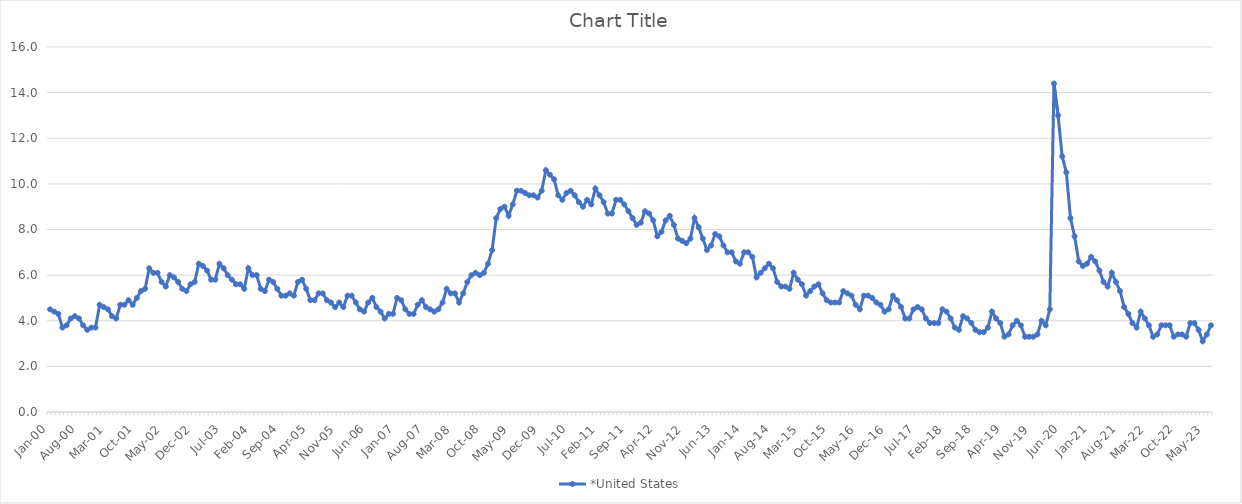
| Category | *United States | Alaska | Alabama | Arkansas | Arizona | California | Colorado | Connecticut | Delaware | Florida | Georgia | Hawaii | Iowa | Idaho | Illinois | Indiana | Kansas | Kentucky | Louisiana | Massachusetts | Maryland | Maine | Michigan | Minnesota | Missouri | Mississippi | Montana | North Carolina | North Dakota | Nebraska | New Hampshire | New Jersey | New Mexico | Nevada | New York | Ohio | Oklahoma | Oregon | Pennsylvania | Rhode Island | South Carolina | South Dakota | Tennessee | Texas | Utah | Virginia | Vermont | Washington | Wisconsin | West Virginia | Wyoming | Series 51 |
|---|---|---|---|---|---|---|---|---|---|---|---|---|---|---|---|---|---|---|---|---|---|---|---|---|---|---|---|---|---|---|---|---|---|---|---|---|---|---|---|---|---|---|---|---|---|---|---|---|---|---|---|---|
| Jan-00 | 4.5 |  |  |  |  |  |  |  |  |  |  |  |  |  |  |  |  |  |  |  |  |  |  |  |  |  |  |  |  |  |  |  |  |  |  |  |  |  |  |  |  |  |  |  |  |  |  |  |  |  |  |  |
| Feb-00 | 4.4 |  |  |  |  |  |  |  |  |  |  |  |  |  |  |  |  |  |  |  |  |  |  |  |  |  |  |  |  |  |  |  |  |  |  |  |  |  |  |  |  |  |  |  |  |  |  |  |  |  |  |  |
| Mar-00 | 4.3 |  |  |  |  |  |  |  |  |  |  |  |  |  |  |  |  |  |  |  |  |  |  |  |  |  |  |  |  |  |  |  |  |  |  |  |  |  |  |  |  |  |  |  |  |  |  |  |  |  |  |  |
| Apr-00 | 3.7 |  |  |  |  |  |  |  |  |  |  |  |  |  |  |  |  |  |  |  |  |  |  |  |  |  |  |  |  |  |  |  |  |  |  |  |  |  |  |  |  |  |  |  |  |  |  |  |  |  |  |  |
| May-00 | 3.8 |  |  |  |  |  |  |  |  |  |  |  |  |  |  |  |  |  |  |  |  |  |  |  |  |  |  |  |  |  |  |  |  |  |  |  |  |  |  |  |  |  |  |  |  |  |  |  |  |  |  |  |
| Jun-00 | 4.1 |  |  |  |  |  |  |  |  |  |  |  |  |  |  |  |  |  |  |  |  |  |  |  |  |  |  |  |  |  |  |  |  |  |  |  |  |  |  |  |  |  |  |  |  |  |  |  |  |  |  |  |
| Jul-00 | 4.2 |  |  |  |  |  |  |  |  |  |  |  |  |  |  |  |  |  |  |  |  |  |  |  |  |  |  |  |  |  |  |  |  |  |  |  |  |  |  |  |  |  |  |  |  |  |  |  |  |  |  |  |
| Aug-00 | 4.1 |  |  |  |  |  |  |  |  |  |  |  |  |  |  |  |  |  |  |  |  |  |  |  |  |  |  |  |  |  |  |  |  |  |  |  |  |  |  |  |  |  |  |  |  |  |  |  |  |  |  |  |
| Sep-00 | 3.8 |  |  |  |  |  |  |  |  |  |  |  |  |  |  |  |  |  |  |  |  |  |  |  |  |  |  |  |  |  |  |  |  |  |  |  |  |  |  |  |  |  |  |  |  |  |  |  |  |  |  |  |
| Oct-00 | 3.6 |  |  |  |  |  |  |  |  |  |  |  |  |  |  |  |  |  |  |  |  |  |  |  |  |  |  |  |  |  |  |  |  |  |  |  |  |  |  |  |  |  |  |  |  |  |  |  |  |  |  |  |
| Nov-00 | 3.7 |  |  |  |  |  |  |  |  |  |  |  |  |  |  |  |  |  |  |  |  |  |  |  |  |  |  |  |  |  |  |  |  |  |  |  |  |  |  |  |  |  |  |  |  |  |  |  |  |  |  |  |
| Dec-00 | 3.7 |  |  |  |  |  |  |  |  |  |  |  |  |  |  |  |  |  |  |  |  |  |  |  |  |  |  |  |  |  |  |  |  |  |  |  |  |  |  |  |  |  |  |  |  |  |  |  |  |  |  |  |
| Jan-01 | 4.7 |  |  |  |  |  |  |  |  |  |  |  |  |  |  |  |  |  |  |  |  |  |  |  |  |  |  |  |  |  |  |  |  |  |  |  |  |  |  |  |  |  |  |  |  |  |  |  |  |  |  |  |
| Feb-01 | 4.6 |  |  |  |  |  |  |  |  |  |  |  |  |  |  |  |  |  |  |  |  |  |  |  |  |  |  |  |  |  |  |  |  |  |  |  |  |  |  |  |  |  |  |  |  |  |  |  |  |  |  |  |
| Mar-01 | 4.5 |  |  |  |  |  |  |  |  |  |  |  |  |  |  |  |  |  |  |  |  |  |  |  |  |  |  |  |  |  |  |  |  |  |  |  |  |  |  |  |  |  |  |  |  |  |  |  |  |  |  |  |
| Apr-01 | 4.2 |  |  |  |  |  |  |  |  |  |  |  |  |  |  |  |  |  |  |  |  |  |  |  |  |  |  |  |  |  |  |  |  |  |  |  |  |  |  |  |  |  |  |  |  |  |  |  |  |  |  |  |
| May-01 | 4.1 |  |  |  |  |  |  |  |  |  |  |  |  |  |  |  |  |  |  |  |  |  |  |  |  |  |  |  |  |  |  |  |  |  |  |  |  |  |  |  |  |  |  |  |  |  |  |  |  |  |  |  |
| Jun-01 | 4.7 |  |  |  |  |  |  |  |  |  |  |  |  |  |  |  |  |  |  |  |  |  |  |  |  |  |  |  |  |  |  |  |  |  |  |  |  |  |  |  |  |  |  |  |  |  |  |  |  |  |  |  |
| Jul-01 | 4.7 |  |  |  |  |  |  |  |  |  |  |  |  |  |  |  |  |  |  |  |  |  |  |  |  |  |  |  |  |  |  |  |  |  |  |  |  |  |  |  |  |  |  |  |  |  |  |  |  |  |  |  |
| Aug-01 | 4.9 |  |  |  |  |  |  |  |  |  |  |  |  |  |  |  |  |  |  |  |  |  |  |  |  |  |  |  |  |  |  |  |  |  |  |  |  |  |  |  |  |  |  |  |  |  |  |  |  |  |  |  |
| Sep-01 | 4.7 |  |  |  |  |  |  |  |  |  |  |  |  |  |  |  |  |  |  |  |  |  |  |  |  |  |  |  |  |  |  |  |  |  |  |  |  |  |  |  |  |  |  |  |  |  |  |  |  |  |  |  |
| Oct-01 | 5 |  |  |  |  |  |  |  |  |  |  |  |  |  |  |  |  |  |  |  |  |  |  |  |  |  |  |  |  |  |  |  |  |  |  |  |  |  |  |  |  |  |  |  |  |  |  |  |  |  |  |  |
| Nov-01 | 5.3 |  |  |  |  |  |  |  |  |  |  |  |  |  |  |  |  |  |  |  |  |  |  |  |  |  |  |  |  |  |  |  |  |  |  |  |  |  |  |  |  |  |  |  |  |  |  |  |  |  |  |  |
| Dec-01 | 5.4 |  |  |  |  |  |  |  |  |  |  |  |  |  |  |  |  |  |  |  |  |  |  |  |  |  |  |  |  |  |  |  |  |  |  |  |  |  |  |  |  |  |  |  |  |  |  |  |  |  |  |  |
| Jan-02 | 6.3 |  |  |  |  |  |  |  |  |  |  |  |  |  |  |  |  |  |  |  |  |  |  |  |  |  |  |  |  |  |  |  |  |  |  |  |  |  |  |  |  |  |  |  |  |  |  |  |  |  |  |  |
| Feb-02 | 6.1 |  |  |  |  |  |  |  |  |  |  |  |  |  |  |  |  |  |  |  |  |  |  |  |  |  |  |  |  |  |  |  |  |  |  |  |  |  |  |  |  |  |  |  |  |  |  |  |  |  |  |  |
| Mar-02 | 6.1 |  |  |  |  |  |  |  |  |  |  |  |  |  |  |  |  |  |  |  |  |  |  |  |  |  |  |  |  |  |  |  |  |  |  |  |  |  |  |  |  |  |  |  |  |  |  |  |  |  |  |  |
| Apr-02 | 5.7 |  |  |  |  |  |  |  |  |  |  |  |  |  |  |  |  |  |  |  |  |  |  |  |  |  |  |  |  |  |  |  |  |  |  |  |  |  |  |  |  |  |  |  |  |  |  |  |  |  |  |  |
| May-02 | 5.5 |  |  |  |  |  |  |  |  |  |  |  |  |  |  |  |  |  |  |  |  |  |  |  |  |  |  |  |  |  |  |  |  |  |  |  |  |  |  |  |  |  |  |  |  |  |  |  |  |  |  |  |
| Jun-02 | 6 |  |  |  |  |  |  |  |  |  |  |  |  |  |  |  |  |  |  |  |  |  |  |  |  |  |  |  |  |  |  |  |  |  |  |  |  |  |  |  |  |  |  |  |  |  |  |  |  |  |  |  |
| Jul-02 | 5.9 |  |  |  |  |  |  |  |  |  |  |  |  |  |  |  |  |  |  |  |  |  |  |  |  |  |  |  |  |  |  |  |  |  |  |  |  |  |  |  |  |  |  |  |  |  |  |  |  |  |  |  |
| Aug-02 | 5.7 |  |  |  |  |  |  |  |  |  |  |  |  |  |  |  |  |  |  |  |  |  |  |  |  |  |  |  |  |  |  |  |  |  |  |  |  |  |  |  |  |  |  |  |  |  |  |  |  |  |  |  |
| Sep-02 | 5.4 |  |  |  |  |  |  |  |  |  |  |  |  |  |  |  |  |  |  |  |  |  |  |  |  |  |  |  |  |  |  |  |  |  |  |  |  |  |  |  |  |  |  |  |  |  |  |  |  |  |  |  |
| Oct-02 | 5.3 |  |  |  |  |  |  |  |  |  |  |  |  |  |  |  |  |  |  |  |  |  |  |  |  |  |  |  |  |  |  |  |  |  |  |  |  |  |  |  |  |  |  |  |  |  |  |  |  |  |  |  |
| Nov-02 | 5.6 |  |  |  |  |  |  |  |  |  |  |  |  |  |  |  |  |  |  |  |  |  |  |  |  |  |  |  |  |  |  |  |  |  |  |  |  |  |  |  |  |  |  |  |  |  |  |  |  |  |  |  |
| Dec-02 | 5.7 |  |  |  |  |  |  |  |  |  |  |  |  |  |  |  |  |  |  |  |  |  |  |  |  |  |  |  |  |  |  |  |  |  |  |  |  |  |  |  |  |  |  |  |  |  |  |  |  |  |  |  |
| Jan-03 | 6.5 |  |  |  |  |  |  |  |  |  |  |  |  |  |  |  |  |  |  |  |  |  |  |  |  |  |  |  |  |  |  |  |  |  |  |  |  |  |  |  |  |  |  |  |  |  |  |  |  |  |  |  |
| Feb-03 | 6.4 |  |  |  |  |  |  |  |  |  |  |  |  |  |  |  |  |  |  |  |  |  |  |  |  |  |  |  |  |  |  |  |  |  |  |  |  |  |  |  |  |  |  |  |  |  |  |  |  |  |  |  |
| Mar-03 | 6.2 |  |  |  |  |  |  |  |  |  |  |  |  |  |  |  |  |  |  |  |  |  |  |  |  |  |  |  |  |  |  |  |  |  |  |  |  |  |  |  |  |  |  |  |  |  |  |  |  |  |  |  |
| Apr-03 | 5.8 |  |  |  |  |  |  |  |  |  |  |  |  |  |  |  |  |  |  |  |  |  |  |  |  |  |  |  |  |  |  |  |  |  |  |  |  |  |  |  |  |  |  |  |  |  |  |  |  |  |  |  |
| May-03 | 5.8 |  |  |  |  |  |  |  |  |  |  |  |  |  |  |  |  |  |  |  |  |  |  |  |  |  |  |  |  |  |  |  |  |  |  |  |  |  |  |  |  |  |  |  |  |  |  |  |  |  |  |  |
| Jun-03 | 6.5 |  |  |  |  |  |  |  |  |  |  |  |  |  |  |  |  |  |  |  |  |  |  |  |  |  |  |  |  |  |  |  |  |  |  |  |  |  |  |  |  |  |  |  |  |  |  |  |  |  |  |  |
| Jul-03 | 6.3 |  |  |  |  |  |  |  |  |  |  |  |  |  |  |  |  |  |  |  |  |  |  |  |  |  |  |  |  |  |  |  |  |  |  |  |  |  |  |  |  |  |  |  |  |  |  |  |  |  |  |  |
| Aug-03 | 6 |  |  |  |  |  |  |  |  |  |  |  |  |  |  |  |  |  |  |  |  |  |  |  |  |  |  |  |  |  |  |  |  |  |  |  |  |  |  |  |  |  |  |  |  |  |  |  |  |  |  |  |
| Sep-03 | 5.8 |  |  |  |  |  |  |  |  |  |  |  |  |  |  |  |  |  |  |  |  |  |  |  |  |  |  |  |  |  |  |  |  |  |  |  |  |  |  |  |  |  |  |  |  |  |  |  |  |  |  |  |
| Oct-03 | 5.6 |  |  |  |  |  |  |  |  |  |  |  |  |  |  |  |  |  |  |  |  |  |  |  |  |  |  |  |  |  |  |  |  |  |  |  |  |  |  |  |  |  |  |  |  |  |  |  |  |  |  |  |
| Nov-03 | 5.6 |  |  |  |  |  |  |  |  |  |  |  |  |  |  |  |  |  |  |  |  |  |  |  |  |  |  |  |  |  |  |  |  |  |  |  |  |  |  |  |  |  |  |  |  |  |  |  |  |  |  |  |
| Dec-03 | 5.4 |  |  |  |  |  |  |  |  |  |  |  |  |  |  |  |  |  |  |  |  |  |  |  |  |  |  |  |  |  |  |  |  |  |  |  |  |  |  |  |  |  |  |  |  |  |  |  |  |  |  |  |
| Jan-04 | 6.3 |  |  |  |  |  |  |  |  |  |  |  |  |  |  |  |  |  |  |  |  |  |  |  |  |  |  |  |  |  |  |  |  |  |  |  |  |  |  |  |  |  |  |  |  |  |  |  |  |  |  |  |
| Feb-04 | 6 |  |  |  |  |  |  |  |  |  |  |  |  |  |  |  |  |  |  |  |  |  |  |  |  |  |  |  |  |  |  |  |  |  |  |  |  |  |  |  |  |  |  |  |  |  |  |  |  |  |  |  |
| Mar-04 | 6 |  |  |  |  |  |  |  |  |  |  |  |  |  |  |  |  |  |  |  |  |  |  |  |  |  |  |  |  |  |  |  |  |  |  |  |  |  |  |  |  |  |  |  |  |  |  |  |  |  |  |  |
| Apr-04 | 5.4 |  |  |  |  |  |  |  |  |  |  |  |  |  |  |  |  |  |  |  |  |  |  |  |  |  |  |  |  |  |  |  |  |  |  |  |  |  |  |  |  |  |  |  |  |  |  |  |  |  |  |  |
| May-04 | 5.3 |  |  |  |  |  |  |  |  |  |  |  |  |  |  |  |  |  |  |  |  |  |  |  |  |  |  |  |  |  |  |  |  |  |  |  |  |  |  |  |  |  |  |  |  |  |  |  |  |  |  |  |
| Jun-04 | 5.8 |  |  |  |  |  |  |  |  |  |  |  |  |  |  |  |  |  |  |  |  |  |  |  |  |  |  |  |  |  |  |  |  |  |  |  |  |  |  |  |  |  |  |  |  |  |  |  |  |  |  |  |
| Jul-04 | 5.7 |  |  |  |  |  |  |  |  |  |  |  |  |  |  |  |  |  |  |  |  |  |  |  |  |  |  |  |  |  |  |  |  |  |  |  |  |  |  |  |  |  |  |  |  |  |  |  |  |  |  |  |
| Aug-04 | 5.4 |  |  |  |  |  |  |  |  |  |  |  |  |  |  |  |  |  |  |  |  |  |  |  |  |  |  |  |  |  |  |  |  |  |  |  |  |  |  |  |  |  |  |  |  |  |  |  |  |  |  |  |
| Sep-04 | 5.1 |  |  |  |  |  |  |  |  |  |  |  |  |  |  |  |  |  |  |  |  |  |  |  |  |  |  |  |  |  |  |  |  |  |  |  |  |  |  |  |  |  |  |  |  |  |  |  |  |  |  |  |
| Oct-04 | 5.1 |  |  |  |  |  |  |  |  |  |  |  |  |  |  |  |  |  |  |  |  |  |  |  |  |  |  |  |  |  |  |  |  |  |  |  |  |  |  |  |  |  |  |  |  |  |  |  |  |  |  |  |
| Nov-04 | 5.2 |  |  |  |  |  |  |  |  |  |  |  |  |  |  |  |  |  |  |  |  |  |  |  |  |  |  |  |  |  |  |  |  |  |  |  |  |  |  |  |  |  |  |  |  |  |  |  |  |  |  |  |
| Dec-04 | 5.1 |  |  |  |  |  |  |  |  |  |  |  |  |  |  |  |  |  |  |  |  |  |  |  |  |  |  |  |  |  |  |  |  |  |  |  |  |  |  |  |  |  |  |  |  |  |  |  |  |  |  |  |
| Jan-05 | 5.7 |  |  |  |  |  |  |  |  |  |  |  |  |  |  |  |  |  |  |  |  |  |  |  |  |  |  |  |  |  |  |  |  |  |  |  |  |  |  |  |  |  |  |  |  |  |  |  |  |  |  |  |
| Feb-05 | 5.8 |  |  |  |  |  |  |  |  |  |  |  |  |  |  |  |  |  |  |  |  |  |  |  |  |  |  |  |  |  |  |  |  |  |  |  |  |  |  |  |  |  |  |  |  |  |  |  |  |  |  |  |
| Mar-05 | 5.4 |  |  |  |  |  |  |  |  |  |  |  |  |  |  |  |  |  |  |  |  |  |  |  |  |  |  |  |  |  |  |  |  |  |  |  |  |  |  |  |  |  |  |  |  |  |  |  |  |  |  |  |
| Apr-05 | 4.9 |  |  |  |  |  |  |  |  |  |  |  |  |  |  |  |  |  |  |  |  |  |  |  |  |  |  |  |  |  |  |  |  |  |  |  |  |  |  |  |  |  |  |  |  |  |  |  |  |  |  |  |
| May-05 | 4.9 |  |  |  |  |  |  |  |  |  |  |  |  |  |  |  |  |  |  |  |  |  |  |  |  |  |  |  |  |  |  |  |  |  |  |  |  |  |  |  |  |  |  |  |  |  |  |  |  |  |  |  |
| Jun-05 | 5.2 |  |  |  |  |  |  |  |  |  |  |  |  |  |  |  |  |  |  |  |  |  |  |  |  |  |  |  |  |  |  |  |  |  |  |  |  |  |  |  |  |  |  |  |  |  |  |  |  |  |  |  |
| Jul-05 | 5.2 |  |  |  |  |  |  |  |  |  |  |  |  |  |  |  |  |  |  |  |  |  |  |  |  |  |  |  |  |  |  |  |  |  |  |  |  |  |  |  |  |  |  |  |  |  |  |  |  |  |  |  |
| Aug-05 | 4.9 |  |  |  |  |  |  |  |  |  |  |  |  |  |  |  |  |  |  |  |  |  |  |  |  |  |  |  |  |  |  |  |  |  |  |  |  |  |  |  |  |  |  |  |  |  |  |  |  |  |  |  |
| Sep-05 | 4.8 |  |  |  |  |  |  |  |  |  |  |  |  |  |  |  |  |  |  |  |  |  |  |  |  |  |  |  |  |  |  |  |  |  |  |  |  |  |  |  |  |  |  |  |  |  |  |  |  |  |  |  |
| Oct-05 | 4.6 |  |  |  |  |  |  |  |  |  |  |  |  |  |  |  |  |  |  |  |  |  |  |  |  |  |  |  |  |  |  |  |  |  |  |  |  |  |  |  |  |  |  |  |  |  |  |  |  |  |  |  |
| Nov-05 | 4.8 |  |  |  |  |  |  |  |  |  |  |  |  |  |  |  |  |  |  |  |  |  |  |  |  |  |  |  |  |  |  |  |  |  |  |  |  |  |  |  |  |  |  |  |  |  |  |  |  |  |  |  |
| Dec-05 | 4.6 |  |  |  |  |  |  |  |  |  |  |  |  |  |  |  |  |  |  |  |  |  |  |  |  |  |  |  |  |  |  |  |  |  |  |  |  |  |  |  |  |  |  |  |  |  |  |  |  |  |  |  |
| Jan-06 | 5.1 |  |  |  |  |  |  |  |  |  |  |  |  |  |  |  |  |  |  |  |  |  |  |  |  |  |  |  |  |  |  |  |  |  |  |  |  |  |  |  |  |  |  |  |  |  |  |  |  |  |  |  |
| Feb-06 | 5.1 |  |  |  |  |  |  |  |  |  |  |  |  |  |  |  |  |  |  |  |  |  |  |  |  |  |  |  |  |  |  |  |  |  |  |  |  |  |  |  |  |  |  |  |  |  |  |  |  |  |  |  |
| Mar-06 | 4.8 |  |  |  |  |  |  |  |  |  |  |  |  |  |  |  |  |  |  |  |  |  |  |  |  |  |  |  |  |  |  |  |  |  |  |  |  |  |  |  |  |  |  |  |  |  |  |  |  |  |  |  |
| Apr-06 | 4.5 |  |  |  |  |  |  |  |  |  |  |  |  |  |  |  |  |  |  |  |  |  |  |  |  |  |  |  |  |  |  |  |  |  |  |  |  |  |  |  |  |  |  |  |  |  |  |  |  |  |  |  |
| May-06 | 4.4 |  |  |  |  |  |  |  |  |  |  |  |  |  |  |  |  |  |  |  |  |  |  |  |  |  |  |  |  |  |  |  |  |  |  |  |  |  |  |  |  |  |  |  |  |  |  |  |  |  |  |  |
| Jun-06 | 4.8 |  |  |  |  |  |  |  |  |  |  |  |  |  |  |  |  |  |  |  |  |  |  |  |  |  |  |  |  |  |  |  |  |  |  |  |  |  |  |  |  |  |  |  |  |  |  |  |  |  |  |  |
| Jul-06 | 5 |  |  |  |  |  |  |  |  |  |  |  |  |  |  |  |  |  |  |  |  |  |  |  |  |  |  |  |  |  |  |  |  |  |  |  |  |  |  |  |  |  |  |  |  |  |  |  |  |  |  |  |
| Aug-06 | 4.6 |  |  |  |  |  |  |  |  |  |  |  |  |  |  |  |  |  |  |  |  |  |  |  |  |  |  |  |  |  |  |  |  |  |  |  |  |  |  |  |  |  |  |  |  |  |  |  |  |  |  |  |
| Sep-06 | 4.4 |  |  |  |  |  |  |  |  |  |  |  |  |  |  |  |  |  |  |  |  |  |  |  |  |  |  |  |  |  |  |  |  |  |  |  |  |  |  |  |  |  |  |  |  |  |  |  |  |  |  |  |
| Oct-06 | 4.1 |  |  |  |  |  |  |  |  |  |  |  |  |  |  |  |  |  |  |  |  |  |  |  |  |  |  |  |  |  |  |  |  |  |  |  |  |  |  |  |  |  |  |  |  |  |  |  |  |  |  |  |
| Nov-06 | 4.3 |  |  |  |  |  |  |  |  |  |  |  |  |  |  |  |  |  |  |  |  |  |  |  |  |  |  |  |  |  |  |  |  |  |  |  |  |  |  |  |  |  |  |  |  |  |  |  |  |  |  |  |
| Dec-06 | 4.3 |  |  |  |  |  |  |  |  |  |  |  |  |  |  |  |  |  |  |  |  |  |  |  |  |  |  |  |  |  |  |  |  |  |  |  |  |  |  |  |  |  |  |  |  |  |  |  |  |  |  |  |
| Jan-07 | 5 |  |  |  |  |  |  |  |  |  |  |  |  |  |  |  |  |  |  |  |  |  |  |  |  |  |  |  |  |  |  |  |  |  |  |  |  |  |  |  |  |  |  |  |  |  |  |  |  |  |  |  |
| Feb-07 | 4.9 |  |  |  |  |  |  |  |  |  |  |  |  |  |  |  |  |  |  |  |  |  |  |  |  |  |  |  |  |  |  |  |  |  |  |  |  |  |  |  |  |  |  |  |  |  |  |  |  |  |  |  |
| Mar-07 | 4.5 |  |  |  |  |  |  |  |  |  |  |  |  |  |  |  |  |  |  |  |  |  |  |  |  |  |  |  |  |  |  |  |  |  |  |  |  |  |  |  |  |  |  |  |  |  |  |  |  |  |  |  |
| Apr-07 | 4.3 |  |  |  |  |  |  |  |  |  |  |  |  |  |  |  |  |  |  |  |  |  |  |  |  |  |  |  |  |  |  |  |  |  |  |  |  |  |  |  |  |  |  |  |  |  |  |  |  |  |  |  |
| May-07 | 4.3 |  |  |  |  |  |  |  |  |  |  |  |  |  |  |  |  |  |  |  |  |  |  |  |  |  |  |  |  |  |  |  |  |  |  |  |  |  |  |  |  |  |  |  |  |  |  |  |  |  |  |  |
| Jun-07 | 4.7 |  |  |  |  |  |  |  |  |  |  |  |  |  |  |  |  |  |  |  |  |  |  |  |  |  |  |  |  |  |  |  |  |  |  |  |  |  |  |  |  |  |  |  |  |  |  |  |  |  |  |  |
| Jul-07 | 4.9 |  |  |  |  |  |  |  |  |  |  |  |  |  |  |  |  |  |  |  |  |  |  |  |  |  |  |  |  |  |  |  |  |  |  |  |  |  |  |  |  |  |  |  |  |  |  |  |  |  |  |  |
| Aug-07 | 4.6 |  |  |  |  |  |  |  |  |  |  |  |  |  |  |  |  |  |  |  |  |  |  |  |  |  |  |  |  |  |  |  |  |  |  |  |  |  |  |  |  |  |  |  |  |  |  |  |  |  |  |  |
| Sep-07 | 4.5 |  |  |  |  |  |  |  |  |  |  |  |  |  |  |  |  |  |  |  |  |  |  |  |  |  |  |  |  |  |  |  |  |  |  |  |  |  |  |  |  |  |  |  |  |  |  |  |  |  |  |  |
| Oct-07 | 4.4 |  |  |  |  |  |  |  |  |  |  |  |  |  |  |  |  |  |  |  |  |  |  |  |  |  |  |  |  |  |  |  |  |  |  |  |  |  |  |  |  |  |  |  |  |  |  |  |  |  |  |  |
| Nov-07 | 4.5 |  |  |  |  |  |  |  |  |  |  |  |  |  |  |  |  |  |  |  |  |  |  |  |  |  |  |  |  |  |  |  |  |  |  |  |  |  |  |  |  |  |  |  |  |  |  |  |  |  |  |  |
| Dec-07 | 4.8 |  |  |  |  |  |  |  |  |  |  |  |  |  |  |  |  |  |  |  |  |  |  |  |  |  |  |  |  |  |  |  |  |  |  |  |  |  |  |  |  |  |  |  |  |  |  |  |  |  |  |  |
| Jan-08 | 5.4 |  |  |  |  |  |  |  |  |  |  |  |  |  |  |  |  |  |  |  |  |  |  |  |  |  |  |  |  |  |  |  |  |  |  |  |  |  |  |  |  |  |  |  |  |  |  |  |  |  |  |  |
| Feb-08 | 5.2 |  |  |  |  |  |  |  |  |  |  |  |  |  |  |  |  |  |  |  |  |  |  |  |  |  |  |  |  |  |  |  |  |  |  |  |  |  |  |  |  |  |  |  |  |  |  |  |  |  |  |  |
| Mar-08 | 5.2 |  |  |  |  |  |  |  |  |  |  |  |  |  |  |  |  |  |  |  |  |  |  |  |  |  |  |  |  |  |  |  |  |  |  |  |  |  |  |  |  |  |  |  |  |  |  |  |  |  |  |  |
| Apr-08 | 4.8 |  |  |  |  |  |  |  |  |  |  |  |  |  |  |  |  |  |  |  |  |  |  |  |  |  |  |  |  |  |  |  |  |  |  |  |  |  |  |  |  |  |  |  |  |  |  |  |  |  |  |  |
| May-08 | 5.2 |  |  |  |  |  |  |  |  |  |  |  |  |  |  |  |  |  |  |  |  |  |  |  |  |  |  |  |  |  |  |  |  |  |  |  |  |  |  |  |  |  |  |  |  |  |  |  |  |  |  |  |
| Jun-08 | 5.7 |  |  |  |  |  |  |  |  |  |  |  |  |  |  |  |  |  |  |  |  |  |  |  |  |  |  |  |  |  |  |  |  |  |  |  |  |  |  |  |  |  |  |  |  |  |  |  |  |  |  |  |
| Jul-08 | 6 |  |  |  |  |  |  |  |  |  |  |  |  |  |  |  |  |  |  |  |  |  |  |  |  |  |  |  |  |  |  |  |  |  |  |  |  |  |  |  |  |  |  |  |  |  |  |  |  |  |  |  |
| Aug-08 | 6.1 |  |  |  |  |  |  |  |  |  |  |  |  |  |  |  |  |  |  |  |  |  |  |  |  |  |  |  |  |  |  |  |  |  |  |  |  |  |  |  |  |  |  |  |  |  |  |  |  |  |  |  |
| Sep-08 | 6 |  |  |  |  |  |  |  |  |  |  |  |  |  |  |  |  |  |  |  |  |  |  |  |  |  |  |  |  |  |  |  |  |  |  |  |  |  |  |  |  |  |  |  |  |  |  |  |  |  |  |  |
| Oct-08 | 6.1 |  |  |  |  |  |  |  |  |  |  |  |  |  |  |  |  |  |  |  |  |  |  |  |  |  |  |  |  |  |  |  |  |  |  |  |  |  |  |  |  |  |  |  |  |  |  |  |  |  |  |  |
| Nov-08 | 6.5 |  |  |  |  |  |  |  |  |  |  |  |  |  |  |  |  |  |  |  |  |  |  |  |  |  |  |  |  |  |  |  |  |  |  |  |  |  |  |  |  |  |  |  |  |  |  |  |  |  |  |  |
| Dec-08 | 7.1 |  |  |  |  |  |  |  |  |  |  |  |  |  |  |  |  |  |  |  |  |  |  |  |  |  |  |  |  |  |  |  |  |  |  |  |  |  |  |  |  |  |  |  |  |  |  |  |  |  |  |  |
| Jan-09 | 8.5 |  |  |  |  |  |  |  |  |  |  |  |  |  |  |  |  |  |  |  |  |  |  |  |  |  |  |  |  |  |  |  |  |  |  |  |  |  |  |  |  |  |  |  |  |  |  |  |  |  |  |  |
| Feb-09 | 8.9 |  |  |  |  |  |  |  |  |  |  |  |  |  |  |  |  |  |  |  |  |  |  |  |  |  |  |  |  |  |  |  |  |  |  |  |  |  |  |  |  |  |  |  |  |  |  |  |  |  |  |  |
| Mar-09 | 9 |  |  |  |  |  |  |  |  |  |  |  |  |  |  |  |  |  |  |  |  |  |  |  |  |  |  |  |  |  |  |  |  |  |  |  |  |  |  |  |  |  |  |  |  |  |  |  |  |  |  |  |
| Apr-09 | 8.6 |  |  |  |  |  |  |  |  |  |  |  |  |  |  |  |  |  |  |  |  |  |  |  |  |  |  |  |  |  |  |  |  |  |  |  |  |  |  |  |  |  |  |  |  |  |  |  |  |  |  |  |
| May-09 | 9.1 |  |  |  |  |  |  |  |  |  |  |  |  |  |  |  |  |  |  |  |  |  |  |  |  |  |  |  |  |  |  |  |  |  |  |  |  |  |  |  |  |  |  |  |  |  |  |  |  |  |  |  |
| Jun-09 | 9.7 |  |  |  |  |  |  |  |  |  |  |  |  |  |  |  |  |  |  |  |  |  |  |  |  |  |  |  |  |  |  |  |  |  |  |  |  |  |  |  |  |  |  |  |  |  |  |  |  |  |  |  |
| Jul-09 | 9.7 |  |  |  |  |  |  |  |  |  |  |  |  |  |  |  |  |  |  |  |  |  |  |  |  |  |  |  |  |  |  |  |  |  |  |  |  |  |  |  |  |  |  |  |  |  |  |  |  |  |  |  |
| Aug-09 | 9.6 |  |  |  |  |  |  |  |  |  |  |  |  |  |  |  |  |  |  |  |  |  |  |  |  |  |  |  |  |  |  |  |  |  |  |  |  |  |  |  |  |  |  |  |  |  |  |  |  |  |  |  |
| Sep-09 | 9.5 |  |  |  |  |  |  |  |  |  |  |  |  |  |  |  |  |  |  |  |  |  |  |  |  |  |  |  |  |  |  |  |  |  |  |  |  |  |  |  |  |  |  |  |  |  |  |  |  |  |  |  |
| Oct-09 | 9.5 |  |  |  |  |  |  |  |  |  |  |  |  |  |  |  |  |  |  |  |  |  |  |  |  |  |  |  |  |  |  |  |  |  |  |  |  |  |  |  |  |  |  |  |  |  |  |  |  |  |  |  |
| Nov-09 | 9.4 |  |  |  |  |  |  |  |  |  |  |  |  |  |  |  |  |  |  |  |  |  |  |  |  |  |  |  |  |  |  |  |  |  |  |  |  |  |  |  |  |  |  |  |  |  |  |  |  |  |  |  |
| Dec-09 | 9.7 |  |  |  |  |  |  |  |  |  |  |  |  |  |  |  |  |  |  |  |  |  |  |  |  |  |  |  |  |  |  |  |  |  |  |  |  |  |  |  |  |  |  |  |  |  |  |  |  |  |  |  |
| Jan-10 | 10.6 |  |  |  |  |  |  |  |  |  |  |  |  |  |  |  |  |  |  |  |  |  |  |  |  |  |  |  |  |  |  |  |  |  |  |  |  |  |  |  |  |  |  |  |  |  |  |  |  |  |  |  |
| Feb-10 | 10.4 |  |  |  |  |  |  |  |  |  |  |  |  |  |  |  |  |  |  |  |  |  |  |  |  |  |  |  |  |  |  |  |  |  |  |  |  |  |  |  |  |  |  |  |  |  |  |  |  |  |  |  |
| Mar-10 | 10.2 |  |  |  |  |  |  |  |  |  |  |  |  |  |  |  |  |  |  |  |  |  |  |  |  |  |  |  |  |  |  |  |  |  |  |  |  |  |  |  |  |  |  |  |  |  |  |  |  |  |  |  |
| Apr-10 | 9.5 |  |  |  |  |  |  |  |  |  |  |  |  |  |  |  |  |  |  |  |  |  |  |  |  |  |  |  |  |  |  |  |  |  |  |  |  |  |  |  |  |  |  |  |  |  |  |  |  |  |  |  |
| May-10 | 9.3 |  |  |  |  |  |  |  |  |  |  |  |  |  |  |  |  |  |  |  |  |  |  |  |  |  |  |  |  |  |  |  |  |  |  |  |  |  |  |  |  |  |  |  |  |  |  |  |  |  |  |  |
| Jun-10 | 9.6 |  |  |  |  |  |  |  |  |  |  |  |  |  |  |  |  |  |  |  |  |  |  |  |  |  |  |  |  |  |  |  |  |  |  |  |  |  |  |  |  |  |  |  |  |  |  |  |  |  |  |  |
| Jul-10 | 9.7 |  |  |  |  |  |  |  |  |  |  |  |  |  |  |  |  |  |  |  |  |  |  |  |  |  |  |  |  |  |  |  |  |  |  |  |  |  |  |  |  |  |  |  |  |  |  |  |  |  |  |  |
| Aug-10 | 9.5 |  |  |  |  |  |  |  |  |  |  |  |  |  |  |  |  |  |  |  |  |  |  |  |  |  |  |  |  |  |  |  |  |  |  |  |  |  |  |  |  |  |  |  |  |  |  |  |  |  |  |  |
| Sep-10 | 9.2 |  |  |  |  |  |  |  |  |  |  |  |  |  |  |  |  |  |  |  |  |  |  |  |  |  |  |  |  |  |  |  |  |  |  |  |  |  |  |  |  |  |  |  |  |  |  |  |  |  |  |  |
| Oct-10 | 9 |  |  |  |  |  |  |  |  |  |  |  |  |  |  |  |  |  |  |  |  |  |  |  |  |  |  |  |  |  |  |  |  |  |  |  |  |  |  |  |  |  |  |  |  |  |  |  |  |  |  |  |
| Nov-10 | 9.3 |  |  |  |  |  |  |  |  |  |  |  |  |  |  |  |  |  |  |  |  |  |  |  |  |  |  |  |  |  |  |  |  |  |  |  |  |  |  |  |  |  |  |  |  |  |  |  |  |  |  |  |
| Dec-10 | 9.1 |  |  |  |  |  |  |  |  |  |  |  |  |  |  |  |  |  |  |  |  |  |  |  |  |  |  |  |  |  |  |  |  |  |  |  |  |  |  |  |  |  |  |  |  |  |  |  |  |  |  |  |
| Jan-11 | 9.8 |  |  |  |  |  |  |  |  |  |  |  |  |  |  |  |  |  |  |  |  |  |  |  |  |  |  |  |  |  |  |  |  |  |  |  |  |  |  |  |  |  |  |  |  |  |  |  |  |  |  |  |
| Feb-11 | 9.5 |  |  |  |  |  |  |  |  |  |  |  |  |  |  |  |  |  |  |  |  |  |  |  |  |  |  |  |  |  |  |  |  |  |  |  |  |  |  |  |  |  |  |  |  |  |  |  |  |  |  |  |
| Mar-11 | 9.2 |  |  |  |  |  |  |  |  |  |  |  |  |  |  |  |  |  |  |  |  |  |  |  |  |  |  |  |  |  |  |  |  |  |  |  |  |  |  |  |  |  |  |  |  |  |  |  |  |  |  |  |
| Apr-11 | 8.7 |  |  |  |  |  |  |  |  |  |  |  |  |  |  |  |  |  |  |  |  |  |  |  |  |  |  |  |  |  |  |  |  |  |  |  |  |  |  |  |  |  |  |  |  |  |  |  |  |  |  |  |
| May-11 | 8.7 |  |  |  |  |  |  |  |  |  |  |  |  |  |  |  |  |  |  |  |  |  |  |  |  |  |  |  |  |  |  |  |  |  |  |  |  |  |  |  |  |  |  |  |  |  |  |  |  |  |  |  |
| Jun-11 | 9.3 |  |  |  |  |  |  |  |  |  |  |  |  |  |  |  |  |  |  |  |  |  |  |  |  |  |  |  |  |  |  |  |  |  |  |  |  |  |  |  |  |  |  |  |  |  |  |  |  |  |  |  |
| Jul-11 | 9.3 |  |  |  |  |  |  |  |  |  |  |  |  |  |  |  |  |  |  |  |  |  |  |  |  |  |  |  |  |  |  |  |  |  |  |  |  |  |  |  |  |  |  |  |  |  |  |  |  |  |  |  |
| Aug-11 | 9.1 |  |  |  |  |  |  |  |  |  |  |  |  |  |  |  |  |  |  |  |  |  |  |  |  |  |  |  |  |  |  |  |  |  |  |  |  |  |  |  |  |  |  |  |  |  |  |  |  |  |  |  |
| Sep-11 | 8.8 |  |  |  |  |  |  |  |  |  |  |  |  |  |  |  |  |  |  |  |  |  |  |  |  |  |  |  |  |  |  |  |  |  |  |  |  |  |  |  |  |  |  |  |  |  |  |  |  |  |  |  |
| Oct-11 | 8.5 |  |  |  |  |  |  |  |  |  |  |  |  |  |  |  |  |  |  |  |  |  |  |  |  |  |  |  |  |  |  |  |  |  |  |  |  |  |  |  |  |  |  |  |  |  |  |  |  |  |  |  |
| Nov-11 | 8.2 |  |  |  |  |  |  |  |  |  |  |  |  |  |  |  |  |  |  |  |  |  |  |  |  |  |  |  |  |  |  |  |  |  |  |  |  |  |  |  |  |  |  |  |  |  |  |  |  |  |  |  |
| Dec-11 | 8.3 |  |  |  |  |  |  |  |  |  |  |  |  |  |  |  |  |  |  |  |  |  |  |  |  |  |  |  |  |  |  |  |  |  |  |  |  |  |  |  |  |  |  |  |  |  |  |  |  |  |  |  |
| Jan-12 | 8.8 |  |  |  |  |  |  |  |  |  |  |  |  |  |  |  |  |  |  |  |  |  |  |  |  |  |  |  |  |  |  |  |  |  |  |  |  |  |  |  |  |  |  |  |  |  |  |  |  |  |  |  |
| Feb-12 | 8.7 |  |  |  |  |  |  |  |  |  |  |  |  |  |  |  |  |  |  |  |  |  |  |  |  |  |  |  |  |  |  |  |  |  |  |  |  |  |  |  |  |  |  |  |  |  |  |  |  |  |  |  |
| Mar-12 | 8.4 |  |  |  |  |  |  |  |  |  |  |  |  |  |  |  |  |  |  |  |  |  |  |  |  |  |  |  |  |  |  |  |  |  |  |  |  |  |  |  |  |  |  |  |  |  |  |  |  |  |  |  |
| Apr-12 | 7.7 |  |  |  |  |  |  |  |  |  |  |  |  |  |  |  |  |  |  |  |  |  |  |  |  |  |  |  |  |  |  |  |  |  |  |  |  |  |  |  |  |  |  |  |  |  |  |  |  |  |  |  |
| May-12 | 7.9 |  |  |  |  |  |  |  |  |  |  |  |  |  |  |  |  |  |  |  |  |  |  |  |  |  |  |  |  |  |  |  |  |  |  |  |  |  |  |  |  |  |  |  |  |  |  |  |  |  |  |  |
| Jun-12 | 8.4 |  |  |  |  |  |  |  |  |  |  |  |  |  |  |  |  |  |  |  |  |  |  |  |  |  |  |  |  |  |  |  |  |  |  |  |  |  |  |  |  |  |  |  |  |  |  |  |  |  |  |  |
| Jul-12 | 8.6 |  |  |  |  |  |  |  |  |  |  |  |  |  |  |  |  |  |  |  |  |  |  |  |  |  |  |  |  |  |  |  |  |  |  |  |  |  |  |  |  |  |  |  |  |  |  |  |  |  |  |  |
| Aug-12 | 8.2 |  |  |  |  |  |  |  |  |  |  |  |  |  |  |  |  |  |  |  |  |  |  |  |  |  |  |  |  |  |  |  |  |  |  |  |  |  |  |  |  |  |  |  |  |  |  |  |  |  |  |  |
| Sep-12 | 7.6 |  |  |  |  |  |  |  |  |  |  |  |  |  |  |  |  |  |  |  |  |  |  |  |  |  |  |  |  |  |  |  |  |  |  |  |  |  |  |  |  |  |  |  |  |  |  |  |  |  |  |  |
| Oct-12 | 7.5 |  |  |  |  |  |  |  |  |  |  |  |  |  |  |  |  |  |  |  |  |  |  |  |  |  |  |  |  |  |  |  |  |  |  |  |  |  |  |  |  |  |  |  |  |  |  |  |  |  |  |  |
| Nov-12 | 7.4 |  |  |  |  |  |  |  |  |  |  |  |  |  |  |  |  |  |  |  |  |  |  |  |  |  |  |  |  |  |  |  |  |  |  |  |  |  |  |  |  |  |  |  |  |  |  |  |  |  |  |  |
| Dec-12 | 7.6 |  |  |  |  |  |  |  |  |  |  |  |  |  |  |  |  |  |  |  |  |  |  |  |  |  |  |  |  |  |  |  |  |  |  |  |  |  |  |  |  |  |  |  |  |  |  |  |  |  |  |  |
| Jan-13 | 8.5 |  |  |  |  |  |  |  |  |  |  |  |  |  |  |  |  |  |  |  |  |  |  |  |  |  |  |  |  |  |  |  |  |  |  |  |  |  |  |  |  |  |  |  |  |  |  |  |  |  |  |  |
| Feb-13 | 8.1 |  |  |  |  |  |  |  |  |  |  |  |  |  |  |  |  |  |  |  |  |  |  |  |  |  |  |  |  |  |  |  |  |  |  |  |  |  |  |  |  |  |  |  |  |  |  |  |  |  |  |  |
| Mar-13 | 7.6 |  |  |  |  |  |  |  |  |  |  |  |  |  |  |  |  |  |  |  |  |  |  |  |  |  |  |  |  |  |  |  |  |  |  |  |  |  |  |  |  |  |  |  |  |  |  |  |  |  |  |  |
| Apr-13 | 7.1 |  |  |  |  |  |  |  |  |  |  |  |  |  |  |  |  |  |  |  |  |  |  |  |  |  |  |  |  |  |  |  |  |  |  |  |  |  |  |  |  |  |  |  |  |  |  |  |  |  |  |  |
| May-13 | 7.3 |  |  |  |  |  |  |  |  |  |  |  |  |  |  |  |  |  |  |  |  |  |  |  |  |  |  |  |  |  |  |  |  |  |  |  |  |  |  |  |  |  |  |  |  |  |  |  |  |  |  |  |
| Jun-13 | 7.8 |  |  |  |  |  |  |  |  |  |  |  |  |  |  |  |  |  |  |  |  |  |  |  |  |  |  |  |  |  |  |  |  |  |  |  |  |  |  |  |  |  |  |  |  |  |  |  |  |  |  |  |
| Jul-13 | 7.7 |  |  |  |  |  |  |  |  |  |  |  |  |  |  |  |  |  |  |  |  |  |  |  |  |  |  |  |  |  |  |  |  |  |  |  |  |  |  |  |  |  |  |  |  |  |  |  |  |  |  |  |
| Aug-13 | 7.3 |  |  |  |  |  |  |  |  |  |  |  |  |  |  |  |  |  |  |  |  |  |  |  |  |  |  |  |  |  |  |  |  |  |  |  |  |  |  |  |  |  |  |  |  |  |  |  |  |  |  |  |
| Sep-13 | 7 |  |  |  |  |  |  |  |  |  |  |  |  |  |  |  |  |  |  |  |  |  |  |  |  |  |  |  |  |  |  |  |  |  |  |  |  |  |  |  |  |  |  |  |  |  |  |  |  |  |  |  |
| Oct-13 | 7 |  |  |  |  |  |  |  |  |  |  |  |  |  |  |  |  |  |  |  |  |  |  |  |  |  |  |  |  |  |  |  |  |  |  |  |  |  |  |  |  |  |  |  |  |  |  |  |  |  |  |  |
| Nov-13 | 6.6 |  |  |  |  |  |  |  |  |  |  |  |  |  |  |  |  |  |  |  |  |  |  |  |  |  |  |  |  |  |  |  |  |  |  |  |  |  |  |  |  |  |  |  |  |  |  |  |  |  |  |  |
| Dec-13 | 6.5 |  |  |  |  |  |  |  |  |  |  |  |  |  |  |  |  |  |  |  |  |  |  |  |  |  |  |  |  |  |  |  |  |  |  |  |  |  |  |  |  |  |  |  |  |  |  |  |  |  |  |  |
| Jan-14 | 7 |  |  |  |  |  |  |  |  |  |  |  |  |  |  |  |  |  |  |  |  |  |  |  |  |  |  |  |  |  |  |  |  |  |  |  |  |  |  |  |  |  |  |  |  |  |  |  |  |  |  |  |
| Feb-14 | 7 |  |  |  |  |  |  |  |  |  |  |  |  |  |  |  |  |  |  |  |  |  |  |  |  |  |  |  |  |  |  |  |  |  |  |  |  |  |  |  |  |  |  |  |  |  |  |  |  |  |  |  |
| Mar-14 | 6.8 |  |  |  |  |  |  |  |  |  |  |  |  |  |  |  |  |  |  |  |  |  |  |  |  |  |  |  |  |  |  |  |  |  |  |  |  |  |  |  |  |  |  |  |  |  |  |  |  |  |  |  |
| Apr-14 | 5.9 |  |  |  |  |  |  |  |  |  |  |  |  |  |  |  |  |  |  |  |  |  |  |  |  |  |  |  |  |  |  |  |  |  |  |  |  |  |  |  |  |  |  |  |  |  |  |  |  |  |  |  |
| May-14 | 6.1 |  |  |  |  |  |  |  |  |  |  |  |  |  |  |  |  |  |  |  |  |  |  |  |  |  |  |  |  |  |  |  |  |  |  |  |  |  |  |  |  |  |  |  |  |  |  |  |  |  |  |  |
| Jun-14 | 6.3 |  |  |  |  |  |  |  |  |  |  |  |  |  |  |  |  |  |  |  |  |  |  |  |  |  |  |  |  |  |  |  |  |  |  |  |  |  |  |  |  |  |  |  |  |  |  |  |  |  |  |  |
| Jul-14 | 6.5 |  |  |  |  |  |  |  |  |  |  |  |  |  |  |  |  |  |  |  |  |  |  |  |  |  |  |  |  |  |  |  |  |  |  |  |  |  |  |  |  |  |  |  |  |  |  |  |  |  |  |  |
| Aug-14 | 6.3 |  |  |  |  |  |  |  |  |  |  |  |  |  |  |  |  |  |  |  |  |  |  |  |  |  |  |  |  |  |  |  |  |  |  |  |  |  |  |  |  |  |  |  |  |  |  |  |  |  |  |  |
| Sep-14 | 5.7 |  |  |  |  |  |  |  |  |  |  |  |  |  |  |  |  |  |  |  |  |  |  |  |  |  |  |  |  |  |  |  |  |  |  |  |  |  |  |  |  |  |  |  |  |  |  |  |  |  |  |  |
| Oct-14 | 5.5 |  |  |  |  |  |  |  |  |  |  |  |  |  |  |  |  |  |  |  |  |  |  |  |  |  |  |  |  |  |  |  |  |  |  |  |  |  |  |  |  |  |  |  |  |  |  |  |  |  |  |  |
| Nov-14 | 5.5 |  |  |  |  |  |  |  |  |  |  |  |  |  |  |  |  |  |  |  |  |  |  |  |  |  |  |  |  |  |  |  |  |  |  |  |  |  |  |  |  |  |  |  |  |  |  |  |  |  |  |  |
| Dec-14 | 5.4 |  |  |  |  |  |  |  |  |  |  |  |  |  |  |  |  |  |  |  |  |  |  |  |  |  |  |  |  |  |  |  |  |  |  |  |  |  |  |  |  |  |  |  |  |  |  |  |  |  |  |  |
| Jan-15 | 6.1 |  |  |  |  |  |  |  |  |  |  |  |  |  |  |  |  |  |  |  |  |  |  |  |  |  |  |  |  |  |  |  |  |  |  |  |  |  |  |  |  |  |  |  |  |  |  |  |  |  |  |  |
| Feb-15 | 5.8 |  |  |  |  |  |  |  |  |  |  |  |  |  |  |  |  |  |  |  |  |  |  |  |  |  |  |  |  |  |  |  |  |  |  |  |  |  |  |  |  |  |  |  |  |  |  |  |  |  |  |  |
| Mar-15 | 5.6 |  |  |  |  |  |  |  |  |  |  |  |  |  |  |  |  |  |  |  |  |  |  |  |  |  |  |  |  |  |  |  |  |  |  |  |  |  |  |  |  |  |  |  |  |  |  |  |  |  |  |  |
| Apr-15 | 5.1 |  |  |  |  |  |  |  |  |  |  |  |  |  |  |  |  |  |  |  |  |  |  |  |  |  |  |  |  |  |  |  |  |  |  |  |  |  |  |  |  |  |  |  |  |  |  |  |  |  |  |  |
| May-15 | 5.3 |  |  |  |  |  |  |  |  |  |  |  |  |  |  |  |  |  |  |  |  |  |  |  |  |  |  |  |  |  |  |  |  |  |  |  |  |  |  |  |  |  |  |  |  |  |  |  |  |  |  |  |
| Jun-15 | 5.5 |  |  |  |  |  |  |  |  |  |  |  |  |  |  |  |  |  |  |  |  |  |  |  |  |  |  |  |  |  |  |  |  |  |  |  |  |  |  |  |  |  |  |  |  |  |  |  |  |  |  |  |
| Jul-15 | 5.6 |  |  |  |  |  |  |  |  |  |  |  |  |  |  |  |  |  |  |  |  |  |  |  |  |  |  |  |  |  |  |  |  |  |  |  |  |  |  |  |  |  |  |  |  |  |  |  |  |  |  |  |
| Aug-15 | 5.2 |  |  |  |  |  |  |  |  |  |  |  |  |  |  |  |  |  |  |  |  |  |  |  |  |  |  |  |  |  |  |  |  |  |  |  |  |  |  |  |  |  |  |  |  |  |  |  |  |  |  |  |
| Sep-15 | 4.9 |  |  |  |  |  |  |  |  |  |  |  |  |  |  |  |  |  |  |  |  |  |  |  |  |  |  |  |  |  |  |  |  |  |  |  |  |  |  |  |  |  |  |  |  |  |  |  |  |  |  |  |
| Oct-15 | 4.8 |  |  |  |  |  |  |  |  |  |  |  |  |  |  |  |  |  |  |  |  |  |  |  |  |  |  |  |  |  |  |  |  |  |  |  |  |  |  |  |  |  |  |  |  |  |  |  |  |  |  |  |
| Nov-15 | 4.8 |  |  |  |  |  |  |  |  |  |  |  |  |  |  |  |  |  |  |  |  |  |  |  |  |  |  |  |  |  |  |  |  |  |  |  |  |  |  |  |  |  |  |  |  |  |  |  |  |  |  |  |
| Dec-15 | 4.8 |  |  |  |  |  |  |  |  |  |  |  |  |  |  |  |  |  |  |  |  |  |  |  |  |  |  |  |  |  |  |  |  |  |  |  |  |  |  |  |  |  |  |  |  |  |  |  |  |  |  |  |
| Jan-16 | 5.3 |  |  |  |  |  |  |  |  |  |  |  |  |  |  |  |  |  |  |  |  |  |  |  |  |  |  |  |  |  |  |  |  |  |  |  |  |  |  |  |  |  |  |  |  |  |  |  |  |  |  |  |
| Feb-16 | 5.2 |  |  |  |  |  |  |  |  |  |  |  |  |  |  |  |  |  |  |  |  |  |  |  |  |  |  |  |  |  |  |  |  |  |  |  |  |  |  |  |  |  |  |  |  |  |  |  |  |  |  |  |
| Mar-16 | 5.1 |  |  |  |  |  |  |  |  |  |  |  |  |  |  |  |  |  |  |  |  |  |  |  |  |  |  |  |  |  |  |  |  |  |  |  |  |  |  |  |  |  |  |  |  |  |  |  |  |  |  |  |
| Apr-16 | 4.7 |  |  |  |  |  |  |  |  |  |  |  |  |  |  |  |  |  |  |  |  |  |  |  |  |  |  |  |  |  |  |  |  |  |  |  |  |  |  |  |  |  |  |  |  |  |  |  |  |  |  |  |
| May-16 | 4.5 |  |  |  |  |  |  |  |  |  |  |  |  |  |  |  |  |  |  |  |  |  |  |  |  |  |  |  |  |  |  |  |  |  |  |  |  |  |  |  |  |  |  |  |  |  |  |  |  |  |  |  |
| Jun-16 | 5.1 |  |  |  |  |  |  |  |  |  |  |  |  |  |  |  |  |  |  |  |  |  |  |  |  |  |  |  |  |  |  |  |  |  |  |  |  |  |  |  |  |  |  |  |  |  |  |  |  |  |  |  |
| Jul-16 | 5.1 |  |  |  |  |  |  |  |  |  |  |  |  |  |  |  |  |  |  |  |  |  |  |  |  |  |  |  |  |  |  |  |  |  |  |  |  |  |  |  |  |  |  |  |  |  |  |  |  |  |  |  |
| Aug-16 | 5 |  |  |  |  |  |  |  |  |  |  |  |  |  |  |  |  |  |  |  |  |  |  |  |  |  |  |  |  |  |  |  |  |  |  |  |  |  |  |  |  |  |  |  |  |  |  |  |  |  |  |  |
| Sep-16 | 4.8 |  |  |  |  |  |  |  |  |  |  |  |  |  |  |  |  |  |  |  |  |  |  |  |  |  |  |  |  |  |  |  |  |  |  |  |  |  |  |  |  |  |  |  |  |  |  |  |  |  |  |  |
| Oct-16 | 4.7 |  |  |  |  |  |  |  |  |  |  |  |  |  |  |  |  |  |  |  |  |  |  |  |  |  |  |  |  |  |  |  |  |  |  |  |  |  |  |  |  |  |  |  |  |  |  |  |  |  |  |  |
| Nov-16 | 4.4 |  |  |  |  |  |  |  |  |  |  |  |  |  |  |  |  |  |  |  |  |  |  |  |  |  |  |  |  |  |  |  |  |  |  |  |  |  |  |  |  |  |  |  |  |  |  |  |  |  |  |  |
| Dec-16 | 4.5 |  |  |  |  |  |  |  |  |  |  |  |  |  |  |  |  |  |  |  |  |  |  |  |  |  |  |  |  |  |  |  |  |  |  |  |  |  |  |  |  |  |  |  |  |  |  |  |  |  |  |  |
| Jan-17 | 5.1 |  |  |  |  |  |  |  |  |  |  |  |  |  |  |  |  |  |  |  |  |  |  |  |  |  |  |  |  |  |  |  |  |  |  |  |  |  |  |  |  |  |  |  |  |  |  |  |  |  |  |  |
| Feb-17 | 4.9 |  |  |  |  |  |  |  |  |  |  |  |  |  |  |  |  |  |  |  |  |  |  |  |  |  |  |  |  |  |  |  |  |  |  |  |  |  |  |  |  |  |  |  |  |  |  |  |  |  |  |  |
| Mar-17 | 4.6 |  |  |  |  |  |  |  |  |  |  |  |  |  |  |  |  |  |  |  |  |  |  |  |  |  |  |  |  |  |  |  |  |  |  |  |  |  |  |  |  |  |  |  |  |  |  |  |  |  |  |  |
| Apr-17 | 4.1 |  |  |  |  |  |  |  |  |  |  |  |  |  |  |  |  |  |  |  |  |  |  |  |  |  |  |  |  |  |  |  |  |  |  |  |  |  |  |  |  |  |  |  |  |  |  |  |  |  |  |  |
| May-17 | 4.1 |  |  |  |  |  |  |  |  |  |  |  |  |  |  |  |  |  |  |  |  |  |  |  |  |  |  |  |  |  |  |  |  |  |  |  |  |  |  |  |  |  |  |  |  |  |  |  |  |  |  |  |
| Jun-17 | 4.5 |  |  |  |  |  |  |  |  |  |  |  |  |  |  |  |  |  |  |  |  |  |  |  |  |  |  |  |  |  |  |  |  |  |  |  |  |  |  |  |  |  |  |  |  |  |  |  |  |  |  |  |
| Jul-17 | 4.6 |  |  |  |  |  |  |  |  |  |  |  |  |  |  |  |  |  |  |  |  |  |  |  |  |  |  |  |  |  |  |  |  |  |  |  |  |  |  |  |  |  |  |  |  |  |  |  |  |  |  |  |
| Aug-17 | 4.5 |  |  |  |  |  |  |  |  |  |  |  |  |  |  |  |  |  |  |  |  |  |  |  |  |  |  |  |  |  |  |  |  |  |  |  |  |  |  |  |  |  |  |  |  |  |  |  |  |  |  |  |
| Sep-17 | 4.1 |  |  |  |  |  |  |  |  |  |  |  |  |  |  |  |  |  |  |  |  |  |  |  |  |  |  |  |  |  |  |  |  |  |  |  |  |  |  |  |  |  |  |  |  |  |  |  |  |  |  |  |
| Oct-17 | 3.9 |  |  |  |  |  |  |  |  |  |  |  |  |  |  |  |  |  |  |  |  |  |  |  |  |  |  |  |  |  |  |  |  |  |  |  |  |  |  |  |  |  |  |  |  |  |  |  |  |  |  |  |
| Nov-17 | 3.9 |  |  |  |  |  |  |  |  |  |  |  |  |  |  |  |  |  |  |  |  |  |  |  |  |  |  |  |  |  |  |  |  |  |  |  |  |  |  |  |  |  |  |  |  |  |  |  |  |  |  |  |
| Dec-17 | 3.9 |  |  |  |  |  |  |  |  |  |  |  |  |  |  |  |  |  |  |  |  |  |  |  |  |  |  |  |  |  |  |  |  |  |  |  |  |  |  |  |  |  |  |  |  |  |  |  |  |  |  |  |
| Jan-18 | 4.5 |  |  |  |  |  |  |  |  |  |  |  |  |  |  |  |  |  |  |  |  |  |  |  |  |  |  |  |  |  |  |  |  |  |  |  |  |  |  |  |  |  |  |  |  |  |  |  |  |  |  |  |
| Feb-18 | 4.4 |  |  |  |  |  |  |  |  |  |  |  |  |  |  |  |  |  |  |  |  |  |  |  |  |  |  |  |  |  |  |  |  |  |  |  |  |  |  |  |  |  |  |  |  |  |  |  |  |  |  |  |
| Mar-18 | 4.1 |  |  |  |  |  |  |  |  |  |  |  |  |  |  |  |  |  |  |  |  |  |  |  |  |  |  |  |  |  |  |  |  |  |  |  |  |  |  |  |  |  |  |  |  |  |  |  |  |  |  |  |
| Apr-18 | 3.7 |  |  |  |  |  |  |  |  |  |  |  |  |  |  |  |  |  |  |  |  |  |  |  |  |  |  |  |  |  |  |  |  |  |  |  |  |  |  |  |  |  |  |  |  |  |  |  |  |  |  |  |
| May-18 | 3.6 |  |  |  |  |  |  |  |  |  |  |  |  |  |  |  |  |  |  |  |  |  |  |  |  |  |  |  |  |  |  |  |  |  |  |  |  |  |  |  |  |  |  |  |  |  |  |  |  |  |  |  |
| Jun-18 | 4.2 |  |  |  |  |  |  |  |  |  |  |  |  |  |  |  |  |  |  |  |  |  |  |  |  |  |  |  |  |  |  |  |  |  |  |  |  |  |  |  |  |  |  |  |  |  |  |  |  |  |  |  |
| Jul-18 | 4.1 |  |  |  |  |  |  |  |  |  |  |  |  |  |  |  |  |  |  |  |  |  |  |  |  |  |  |  |  |  |  |  |  |  |  |  |  |  |  |  |  |  |  |  |  |  |  |  |  |  |  |  |
| Aug-18 | 3.9 |  |  |  |  |  |  |  |  |  |  |  |  |  |  |  |  |  |  |  |  |  |  |  |  |  |  |  |  |  |  |  |  |  |  |  |  |  |  |  |  |  |  |  |  |  |  |  |  |  |  |  |
| Sep-18 | 3.6 |  |  |  |  |  |  |  |  |  |  |  |  |  |  |  |  |  |  |  |  |  |  |  |  |  |  |  |  |  |  |  |  |  |  |  |  |  |  |  |  |  |  |  |  |  |  |  |  |  |  |  |
| Oct-18 | 3.5 |  |  |  |  |  |  |  |  |  |  |  |  |  |  |  |  |  |  |  |  |  |  |  |  |  |  |  |  |  |  |  |  |  |  |  |  |  |  |  |  |  |  |  |  |  |  |  |  |  |  |  |
| Nov-18 | 3.5 |  |  |  |  |  |  |  |  |  |  |  |  |  |  |  |  |  |  |  |  |  |  |  |  |  |  |  |  |  |  |  |  |  |  |  |  |  |  |  |  |  |  |  |  |  |  |  |  |  |  |  |
| Dec-18 | 3.7 |  |  |  |  |  |  |  |  |  |  |  |  |  |  |  |  |  |  |  |  |  |  |  |  |  |  |  |  |  |  |  |  |  |  |  |  |  |  |  |  |  |  |  |  |  |  |  |  |  |  |  |
| Jan-19 | 4.4 |  |  |  |  |  |  |  |  |  |  |  |  |  |  |  |  |  |  |  |  |  |  |  |  |  |  |  |  |  |  |  |  |  |  |  |  |  |  |  |  |  |  |  |  |  |  |  |  |  |  |  |
| Feb-19 | 4.1 |  |  |  |  |  |  |  |  |  |  |  |  |  |  |  |  |  |  |  |  |  |  |  |  |  |  |  |  |  |  |  |  |  |  |  |  |  |  |  |  |  |  |  |  |  |  |  |  |  |  |  |
| Mar-19 | 3.9 |  |  |  |  |  |  |  |  |  |  |  |  |  |  |  |  |  |  |  |  |  |  |  |  |  |  |  |  |  |  |  |  |  |  |  |  |  |  |  |  |  |  |  |  |  |  |  |  |  |  |  |
| Apr-19 | 3.3 |  |  |  |  |  |  |  |  |  |  |  |  |  |  |  |  |  |  |  |  |  |  |  |  |  |  |  |  |  |  |  |  |  |  |  |  |  |  |  |  |  |  |  |  |  |  |  |  |  |  |  |
| May-19 | 3.4 |  |  |  |  |  |  |  |  |  |  |  |  |  |  |  |  |  |  |  |  |  |  |  |  |  |  |  |  |  |  |  |  |  |  |  |  |  |  |  |  |  |  |  |  |  |  |  |  |  |  |  |
| Jun-19 | 3.8 |  |  |  |  |  |  |  |  |  |  |  |  |  |  |  |  |  |  |  |  |  |  |  |  |  |  |  |  |  |  |  |  |  |  |  |  |  |  |  |  |  |  |  |  |  |  |  |  |  |  |  |
| Jul-19 | 4 |  |  |  |  |  |  |  |  |  |  |  |  |  |  |  |  |  |  |  |  |  |  |  |  |  |  |  |  |  |  |  |  |  |  |  |  |  |  |  |  |  |  |  |  |  |  |  |  |  |  |  |
| Aug-19 | 3.8 |  |  |  |  |  |  |  |  |  |  |  |  |  |  |  |  |  |  |  |  |  |  |  |  |  |  |  |  |  |  |  |  |  |  |  |  |  |  |  |  |  |  |  |  |  |  |  |  |  |  |  |
| Sep-19 | 3.3 |  |  |  |  |  |  |  |  |  |  |  |  |  |  |  |  |  |  |  |  |  |  |  |  |  |  |  |  |  |  |  |  |  |  |  |  |  |  |  |  |  |  |  |  |  |  |  |  |  |  |  |
| Oct-19 | 3.3 |  |  |  |  |  |  |  |  |  |  |  |  |  |  |  |  |  |  |  |  |  |  |  |  |  |  |  |  |  |  |  |  |  |  |  |  |  |  |  |  |  |  |  |  |  |  |  |  |  |  |  |
| Nov-19 | 3.3 |  |  |  |  |  |  |  |  |  |  |  |  |  |  |  |  |  |  |  |  |  |  |  |  |  |  |  |  |  |  |  |  |  |  |  |  |  |  |  |  |  |  |  |  |  |  |  |  |  |  |  |
| Dec-19 | 3.4 |  |  |  |  |  |  |  |  |  |  |  |  |  |  |  |  |  |  |  |  |  |  |  |  |  |  |  |  |  |  |  |  |  |  |  |  |  |  |  |  |  |  |  |  |  |  |  |  |  |  |  |
| Jan-20 | 4 |  |  |  |  |  |  |  |  |  |  |  |  |  |  |  |  |  |  |  |  |  |  |  |  |  |  |  |  |  |  |  |  |  |  |  |  |  |  |  |  |  |  |  |  |  |  |  |  |  |  |  |
| Feb-20 | 3.8 |  |  |  |  |  |  |  |  |  |  |  |  |  |  |  |  |  |  |  |  |  |  |  |  |  |  |  |  |  |  |  |  |  |  |  |  |  |  |  |  |  |  |  |  |  |  |  |  |  |  |  |
| Mar-20 | 4.5 |  |  |  |  |  |  |  |  |  |  |  |  |  |  |  |  |  |  |  |  |  |  |  |  |  |  |  |  |  |  |  |  |  |  |  |  |  |  |  |  |  |  |  |  |  |  |  |  |  |  |  |
| Apr-20 | 14.4 |  |  |  |  |  |  |  |  |  |  |  |  |  |  |  |  |  |  |  |  |  |  |  |  |  |  |  |  |  |  |  |  |  |  |  |  |  |  |  |  |  |  |  |  |  |  |  |  |  |  |  |
| May-20 | 13 |  |  |  |  |  |  |  |  |  |  |  |  |  |  |  |  |  |  |  |  |  |  |  |  |  |  |  |  |  |  |  |  |  |  |  |  |  |  |  |  |  |  |  |  |  |  |  |  |  |  |  |
| Jun-20 | 11.2 |  |  |  |  |  |  |  |  |  |  |  |  |  |  |  |  |  |  |  |  |  |  |  |  |  |  |  |  |  |  |  |  |  |  |  |  |  |  |  |  |  |  |  |  |  |  |  |  |  |  |  |
| Jul-20 | 10.5 |  |  |  |  |  |  |  |  |  |  |  |  |  |  |  |  |  |  |  |  |  |  |  |  |  |  |  |  |  |  |  |  |  |  |  |  |  |  |  |  |  |  |  |  |  |  |  |  |  |  |  |
| Aug-20 | 8.5 |  |  |  |  |  |  |  |  |  |  |  |  |  |  |  |  |  |  |  |  |  |  |  |  |  |  |  |  |  |  |  |  |  |  |  |  |  |  |  |  |  |  |  |  |  |  |  |  |  |  |  |
| Sep-20 | 7.7 |  |  |  |  |  |  |  |  |  |  |  |  |  |  |  |  |  |  |  |  |  |  |  |  |  |  |  |  |  |  |  |  |  |  |  |  |  |  |  |  |  |  |  |  |  |  |  |  |  |  |  |
| Oct-20 | 6.6 |  |  |  |  |  |  |  |  |  |  |  |  |  |  |  |  |  |  |  |  |  |  |  |  |  |  |  |  |  |  |  |  |  |  |  |  |  |  |  |  |  |  |  |  |  |  |  |  |  |  |  |
| Nov-20 | 6.4 |  |  |  |  |  |  |  |  |  |  |  |  |  |  |  |  |  |  |  |  |  |  |  |  |  |  |  |  |  |  |  |  |  |  |  |  |  |  |  |  |  |  |  |  |  |  |  |  |  |  |  |
| Dec-20 | 6.5 |  |  |  |  |  |  |  |  |  |  |  |  |  |  |  |  |  |  |  |  |  |  |  |  |  |  |  |  |  |  |  |  |  |  |  |  |  |  |  |  |  |  |  |  |  |  |  |  |  |  |  |
| Jan-21 | 6.8 |  |  |  |  |  |  |  |  |  |  |  |  |  |  |  |  |  |  |  |  |  |  |  |  |  |  |  |  |  |  |  |  |  |  |  |  |  |  |  |  |  |  |  |  |  |  |  |  |  |  |  |
| Feb-21 | 6.6 |  |  |  |  |  |  |  |  |  |  |  |  |  |  |  |  |  |  |  |  |  |  |  |  |  |  |  |  |  |  |  |  |  |  |  |  |  |  |  |  |  |  |  |  |  |  |  |  |  |  |  |
| Mar-21 | 6.2 |  |  |  |  |  |  |  |  |  |  |  |  |  |  |  |  |  |  |  |  |  |  |  |  |  |  |  |  |  |  |  |  |  |  |  |  |  |  |  |  |  |  |  |  |  |  |  |  |  |  |  |
| Apr-21 | 5.7 |  |  |  |  |  |  |  |  |  |  |  |  |  |  |  |  |  |  |  |  |  |  |  |  |  |  |  |  |  |  |  |  |  |  |  |  |  |  |  |  |  |  |  |  |  |  |  |  |  |  |  |
| May-21 | 5.5 |  |  |  |  |  |  |  |  |  |  |  |  |  |  |  |  |  |  |  |  |  |  |  |  |  |  |  |  |  |  |  |  |  |  |  |  |  |  |  |  |  |  |  |  |  |  |  |  |  |  |  |
| Jun-21 | 6.1 |  |  |  |  |  |  |  |  |  |  |  |  |  |  |  |  |  |  |  |  |  |  |  |  |  |  |  |  |  |  |  |  |  |  |  |  |  |  |  |  |  |  |  |  |  |  |  |  |  |  |  |
| Jul-21 | 5.7 |  |  |  |  |  |  |  |  |  |  |  |  |  |  |  |  |  |  |  |  |  |  |  |  |  |  |  |  |  |  |  |  |  |  |  |  |  |  |  |  |  |  |  |  |  |  |  |  |  |  |  |
| Aug-21 | 5.3 |  |  |  |  |  |  |  |  |  |  |  |  |  |  |  |  |  |  |  |  |  |  |  |  |  |  |  |  |  |  |  |  |  |  |  |  |  |  |  |  |  |  |  |  |  |  |  |  |  |  |  |
| Sep-21 | 4.6 |  |  |  |  |  |  |  |  |  |  |  |  |  |  |  |  |  |  |  |  |  |  |  |  |  |  |  |  |  |  |  |  |  |  |  |  |  |  |  |  |  |  |  |  |  |  |  |  |  |  |  |
| Oct-21 | 4.3 |  |  |  |  |  |  |  |  |  |  |  |  |  |  |  |  |  |  |  |  |  |  |  |  |  |  |  |  |  |  |  |  |  |  |  |  |  |  |  |  |  |  |  |  |  |  |  |  |  |  |  |
| Nov-21 | 3.9 |  |  |  |  |  |  |  |  |  |  |  |  |  |  |  |  |  |  |  |  |  |  |  |  |  |  |  |  |  |  |  |  |  |  |  |  |  |  |  |  |  |  |  |  |  |  |  |  |  |  |  |
| Dec-21 | 3.7 |  |  |  |  |  |  |  |  |  |  |  |  |  |  |  |  |  |  |  |  |  |  |  |  |  |  |  |  |  |  |  |  |  |  |  |  |  |  |  |  |  |  |  |  |  |  |  |  |  |  |  |
| Jan-22 | 4.4 |  |  |  |  |  |  |  |  |  |  |  |  |  |  |  |  |  |  |  |  |  |  |  |  |  |  |  |  |  |  |  |  |  |  |  |  |  |  |  |  |  |  |  |  |  |  |  |  |  |  |  |
| Feb-22 | 4.1 |  |  |  |  |  |  |  |  |  |  |  |  |  |  |  |  |  |  |  |  |  |  |  |  |  |  |  |  |  |  |  |  |  |  |  |  |  |  |  |  |  |  |  |  |  |  |  |  |  |  |  |
| Mar-22 | 3.8 |  |  |  |  |  |  |  |  |  |  |  |  |  |  |  |  |  |  |  |  |  |  |  |  |  |  |  |  |  |  |  |  |  |  |  |  |  |  |  |  |  |  |  |  |  |  |  |  |  |  |  |
| Apr-22 | 3.3 |  |  |  |  |  |  |  |  |  |  |  |  |  |  |  |  |  |  |  |  |  |  |  |  |  |  |  |  |  |  |  |  |  |  |  |  |  |  |  |  |  |  |  |  |  |  |  |  |  |  |  |
| May-22 | 3.4 |  |  |  |  |  |  |  |  |  |  |  |  |  |  |  |  |  |  |  |  |  |  |  |  |  |  |  |  |  |  |  |  |  |  |  |  |  |  |  |  |  |  |  |  |  |  |  |  |  |  |  |
| Jun-22 | 3.8 |  |  |  |  |  |  |  |  |  |  |  |  |  |  |  |  |  |  |  |  |  |  |  |  |  |  |  |  |  |  |  |  |  |  |  |  |  |  |  |  |  |  |  |  |  |  |  |  |  |  |  |
| Jul-22 | 3.8 |  |  |  |  |  |  |  |  |  |  |  |  |  |  |  |  |  |  |  |  |  |  |  |  |  |  |  |  |  |  |  |  |  |  |  |  |  |  |  |  |  |  |  |  |  |  |  |  |  |  |  |
| Aug-22 | 3.8 |  |  |  |  |  |  |  |  |  |  |  |  |  |  |  |  |  |  |  |  |  |  |  |  |  |  |  |  |  |  |  |  |  |  |  |  |  |  |  |  |  |  |  |  |  |  |  |  |  |  |  |
| Sep-22 | 3.3 |  |  |  |  |  |  |  |  |  |  |  |  |  |  |  |  |  |  |  |  |  |  |  |  |  |  |  |  |  |  |  |  |  |  |  |  |  |  |  |  |  |  |  |  |  |  |  |  |  |  |  |
| Oct-22 | 3.4 |  |  |  |  |  |  |  |  |  |  |  |  |  |  |  |  |  |  |  |  |  |  |  |  |  |  |  |  |  |  |  |  |  |  |  |  |  |  |  |  |  |  |  |  |  |  |  |  |  |  |  |
| Nov-22 | 3.4 |  |  |  |  |  |  |  |  |  |  |  |  |  |  |  |  |  |  |  |  |  |  |  |  |  |  |  |  |  |  |  |  |  |  |  |  |  |  |  |  |  |  |  |  |  |  |  |  |  |  |  |
| Dec-22 | 3.3 |  |  |  |  |  |  |  |  |  |  |  |  |  |  |  |  |  |  |  |  |  |  |  |  |  |  |  |  |  |  |  |  |  |  |  |  |  |  |  |  |  |  |  |  |  |  |  |  |  |  |  |
| Jan-23 | 3.9 |  |  |  |  |  |  |  |  |  |  |  |  |  |  |  |  |  |  |  |  |  |  |  |  |  |  |  |  |  |  |  |  |  |  |  |  |  |  |  |  |  |  |  |  |  |  |  |  |  |  |  |
| Feb-23 | 3.9 |  |  |  |  |  |  |  |  |  |  |  |  |  |  |  |  |  |  |  |  |  |  |  |  |  |  |  |  |  |  |  |  |  |  |  |  |  |  |  |  |  |  |  |  |  |  |  |  |  |  |  |
| Mar-23 | 3.6 |  |  |  |  |  |  |  |  |  |  |  |  |  |  |  |  |  |  |  |  |  |  |  |  |  |  |  |  |  |  |  |  |  |  |  |  |  |  |  |  |  |  |  |  |  |  |  |  |  |  |  |
| Apr-23 | 3.1 |  |  |  |  |  |  |  |  |  |  |  |  |  |  |  |  |  |  |  |  |  |  |  |  |  |  |  |  |  |  |  |  |  |  |  |  |  |  |  |  |  |  |  |  |  |  |  |  |  |  |  |
| May-23 | 3.4 |  |  |  |  |  |  |  |  |  |  |  |  |  |  |  |  |  |  |  |  |  |  |  |  |  |  |  |  |  |  |  |  |  |  |  |  |  |  |  |  |  |  |  |  |  |  |  |  |  |  |  |
| Jun-23 | 3.8 |  |  |  |  |  |  |  |  |  |  |  |  |  |  |  |  |  |  |  |  |  |  |  |  |  |  |  |  |  |  |  |  |  |  |  |  |  |  |  |  |  |  |  |  |  |  |  |  |  |  |  |